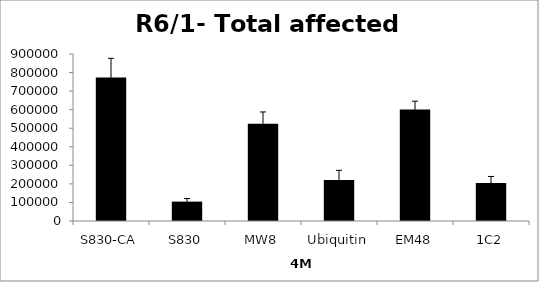
| Category | Series 0 |
|---|---|
| S830-CA | 773313.875 |
| S830 | 104463.392 |
| MW8 | 524286.419 |
| Ubiquitin | 221432.728 |
| EM48 | 600399.331 |
| 1C2 | 204951.014 |